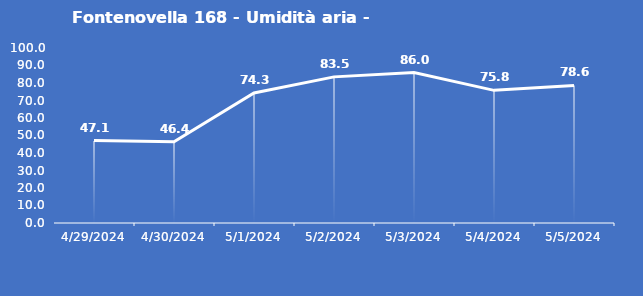
| Category | Fontenovella 168 - Umidità aria - Grezzo (%) |
|---|---|
| 4/29/24 | 47.1 |
| 4/30/24 | 46.4 |
| 5/1/24 | 74.3 |
| 5/2/24 | 83.5 |
| 5/3/24 | 86 |
| 5/4/24 | 75.8 |
| 5/5/24 | 78.6 |